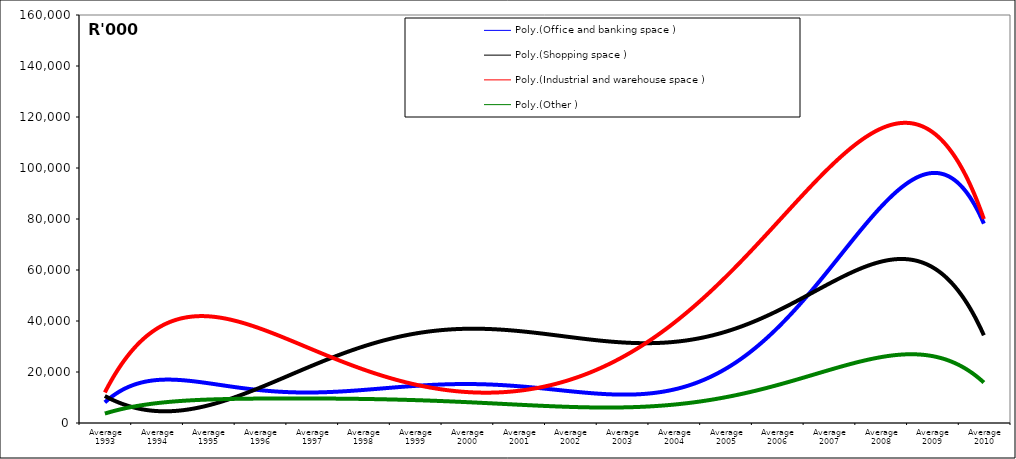
| Category | Office and banking space | Shopping space | Industrial and warehouse space | Other |
|---|---|---|---|---|
| Average 1993 | 4589.833 | 8521.917 | 14460.417 | 4149.25 |
| Average 1994 | 27548 | 7273 | 23658.417 | 6637.667 |
| Average 1995 | 7632.833 | 14592.083 | 62975.083 | 9236.333 |
| Average 1996 | 11382 | 7548.667 | 31883.167 | 10698.917 |
| Average 1997 | 12204 | 10886.083 | 19974 | 10343.75 |
| Average 1998 | 12456.75 | 13279.583 | 21669.333 | 7928.083 |
| Average 1999 | 20132 | 89936.583 | 11261.833 | 9889.583 |
| Average 2000 | 8566.167 | 28239.25 | 18105.833 | 6037.167 |
| Average 2001 | 23872.667 | 4859.333 | 16001.25 | 7376.667 |
| Average 2002 | 10190.5 | 24836.833 | 25362.833 | 9184.667 |
| Average 2003 | 5636.167 | 58835.75 | 19439.167 | 4632.75 |
| Average 2004 | 15010.917 | 28198.75 | 28292.417 | 8784.667 |
| Average 2005 | 12175.833 | 39097.667 | 55472.5 | 6560.75 |
| Average 2006 | 53851.083 | 32899.917 | 90039.167 | 15331.583 |
| Average 2007 | 46461.083 | 52106.5 | 89748.667 | 25820 |
| Average 2008 | 98955.083 | 78463.167 | 136256.917 | 19537.75 |
| Average 2009 | 86428.667 | 50133.417 | 94567.833 | 29553.583 |
| Average 2010 | 81361.286 | 36770.286 | 85363.143 | 15072.571 |